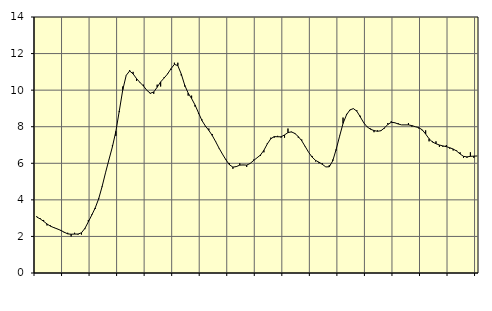
| Category | Piggar | Series 1 |
|---|---|---|
| nan | 3.1 | 3.06 |
| 87.0 | 3 | 2.96 |
| 87.0 | 2.9 | 2.83 |
| 87.0 | 2.6 | 2.68 |
| nan | 2.6 | 2.56 |
| 88.0 | 2.5 | 2.48 |
| 88.0 | 2.4 | 2.41 |
| 88.0 | 2.3 | 2.33 |
| nan | 2.2 | 2.23 |
| 89.0 | 2.2 | 2.14 |
| 89.0 | 2 | 2.12 |
| 89.0 | 2.2 | 2.13 |
| nan | 2.1 | 2.13 |
| 90.0 | 2.1 | 2.2 |
| 90.0 | 2.4 | 2.44 |
| 90.0 | 2.9 | 2.8 |
| nan | 3.2 | 3.17 |
| 91.0 | 3.5 | 3.56 |
| 91.0 | 4.1 | 4.06 |
| 91.0 | 4.7 | 4.73 |
| nan | 5.5 | 5.49 |
| 92.0 | 6.2 | 6.21 |
| 92.0 | 7 | 6.91 |
| 92.0 | 7.5 | 7.75 |
| nan | 8.8 | 8.87 |
| 93.0 | 10.2 | 10.02 |
| 93.0 | 10.8 | 10.81 |
| 93.0 | 11.1 | 11.05 |
| nan | 11 | 10.89 |
| 94.0 | 10.5 | 10.63 |
| 94.0 | 10.4 | 10.42 |
| 94.0 | 10.3 | 10.23 |
| nan | 10 | 9.99 |
| 95.0 | 9.8 | 9.83 |
| 95.0 | 9.8 | 9.9 |
| 95.0 | 10.3 | 10.16 |
| nan | 10.2 | 10.45 |
| 96.0 | 10.7 | 10.66 |
| 96.0 | 10.9 | 10.88 |
| 96.0 | 11.1 | 11.17 |
| nan | 11.5 | 11.41 |
| 97.0 | 11.5 | 11.34 |
| 97.0 | 10.8 | 10.88 |
| 97.0 | 10.2 | 10.27 |
| nan | 9.7 | 9.84 |
| 98.0 | 9.7 | 9.54 |
| 98.0 | 9.1 | 9.19 |
| 98.0 | 8.7 | 8.76 |
| nan | 8.4 | 8.34 |
| 99.0 | 8 | 8.04 |
| 99.0 | 7.9 | 7.8 |
| 99.0 | 7.6 | 7.52 |
| nan | 7.2 | 7.18 |
| 0.0 | 6.8 | 6.82 |
| 0.0 | 6.5 | 6.49 |
| 0.0 | 6.2 | 6.18 |
| nan | 6 | 5.92 |
| 1.0 | 5.7 | 5.79 |
| 1.0 | 5.8 | 5.82 |
| 1.0 | 6 | 5.9 |
| nan | 5.9 | 5.91 |
| 2.0 | 5.8 | 5.9 |
| 2.0 | 6 | 5.99 |
| 2.0 | 6.2 | 6.15 |
| nan | 6.3 | 6.3 |
| 3.0 | 6.4 | 6.45 |
| 3.0 | 6.6 | 6.71 |
| 3.0 | 7.1 | 7.06 |
| nan | 7.4 | 7.34 |
| 4.0 | 7.4 | 7.46 |
| 4.0 | 7.5 | 7.45 |
| 4.0 | 7.4 | 7.45 |
| nan | 7.4 | 7.55 |
| 5.0 | 7.9 | 7.68 |
| 5.0 | 7.7 | 7.72 |
| 5.0 | 7.6 | 7.63 |
| nan | 7.4 | 7.46 |
| 6.0 | 7.3 | 7.23 |
| 6.0 | 6.9 | 6.92 |
| 6.0 | 6.6 | 6.6 |
| nan | 6.4 | 6.34 |
| 7.0 | 6.1 | 6.16 |
| 7.0 | 6 | 6.06 |
| 7.0 | 6 | 5.94 |
| nan | 5.8 | 5.8 |
| 8.0 | 5.9 | 5.81 |
| 8.0 | 6.2 | 6.13 |
| 8.0 | 6.7 | 6.76 |
| nan | 7.5 | 7.48 |
| 9.0 | 8.5 | 8.18 |
| 9.0 | 8.7 | 8.65 |
| 9.0 | 8.9 | 8.92 |
| nan | 9 | 8.99 |
| 10.0 | 8.9 | 8.85 |
| 10.0 | 8.6 | 8.54 |
| 10.0 | 8.2 | 8.22 |
| nan | 8 | 7.99 |
| 11.0 | 7.9 | 7.86 |
| 11.0 | 7.7 | 7.79 |
| 11.0 | 7.8 | 7.75 |
| nan | 7.8 | 7.78 |
| 12.0 | 7.9 | 7.93 |
| 12.0 | 8.2 | 8.12 |
| 12.0 | 8.3 | 8.24 |
| nan | 8.2 | 8.22 |
| 13.0 | 8.2 | 8.15 |
| 13.0 | 8.1 | 8.1 |
| 13.0 | 8.1 | 8.1 |
| nan | 8.2 | 8.1 |
| 14.0 | 8 | 8.06 |
| 14.0 | 8 | 8 |
| 14.0 | 7.9 | 7.95 |
| nan | 7.8 | 7.83 |
| 15.0 | 7.8 | 7.6 |
| 15.0 | 7.2 | 7.34 |
| 15.0 | 7.2 | 7.16 |
| nan | 7.2 | 7.07 |
| 16.0 | 6.9 | 7 |
| 16.0 | 6.9 | 6.95 |
| 16.0 | 7 | 6.91 |
| nan | 6.8 | 6.85 |
| 17.0 | 6.7 | 6.78 |
| 17.0 | 6.7 | 6.67 |
| 17.0 | 6.6 | 6.51 |
| nan | 6.3 | 6.38 |
| 18.0 | 6.3 | 6.35 |
| 18.0 | 6.6 | 6.38 |
| 18.0 | 6.3 | 6.39 |
| nan | 6.4 | 6.4 |